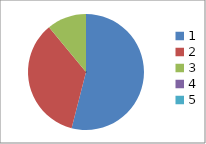
| Category | Series 0 |
|---|---|
| 0 | 0.54 |
| 1 | 0.35 |
| 2 | 0.11 |
| 3 | 0 |
| 4 | 0 |